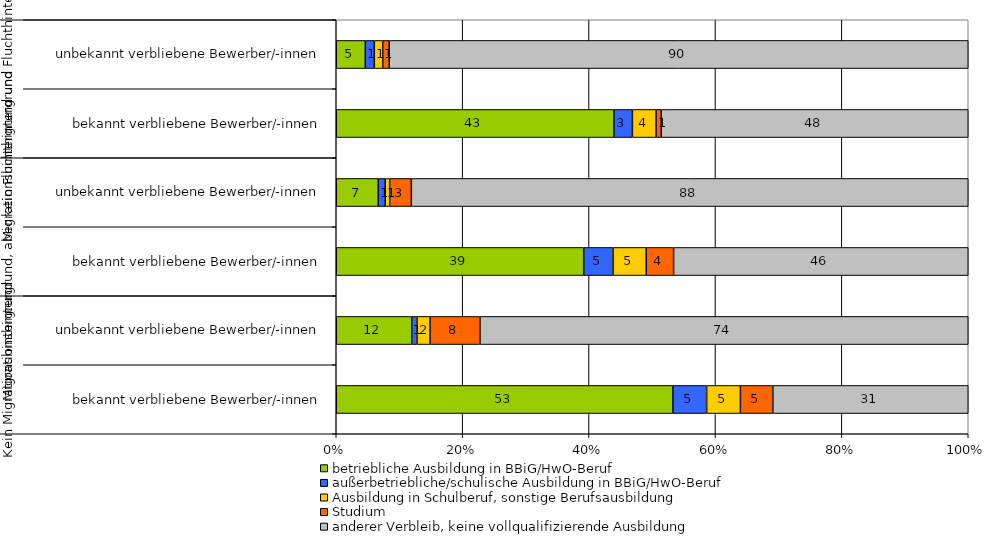
| Category | betriebliche Ausbildung in BBiG/HwO-Beruf | außerbetriebliche/schulische Ausbildung in BBiG/HwO-Beruf | Ausbildung in Schulberuf, sonstige Berufsausbildung | Studium | anderer Verbleib, keine vollqualifizierende Ausbildung |
|---|---|---|---|---|---|
| 0 | 52.9 | 5.3 | 5.3 | 5.1 | 30.7 |
| 1 | 11.5 | 0.8 | 2 | 7.6 | 74.4 |
| 2 | 38.8 | 4.6 | 5.2 | 4.3 | 46.2 |
| 3 | 6.6 | 1.1 | 0.7 | 3.4 | 87.5 |
| 4 | 43.4 | 2.9 | 3.7 | 0.8 | 48 |
| 5 | 4.5 | 1.4 | 1.3 | 1 | 89.7 |